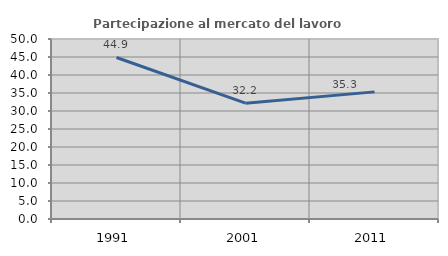
| Category | Partecipazione al mercato del lavoro  femminile |
|---|---|
| 1991.0 | 44.869 |
| 2001.0 | 32.17 |
| 2011.0 | 35.314 |